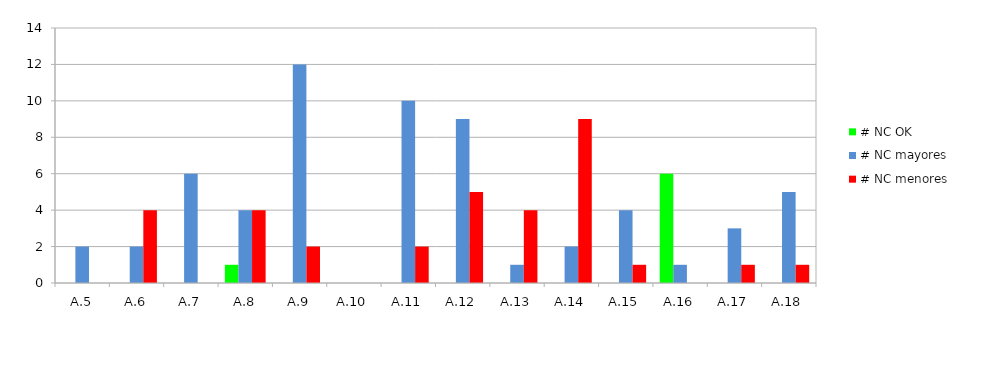
| Category | # NC OK | # NC mayores | # NC menores |
|---|---|---|---|
| A.5 | 0 | 2 | 0 |
| A.6 | 0 | 2 | 4 |
| A.7 | 0 | 6 | 0 |
| A.8 | 1 | 4 | 4 |
| A.9 | 0 | 12 | 2 |
| A.10 | 0 | 0 | 0 |
| A.11 | 0 | 10 | 2 |
| A.12 | 0 | 9 | 5 |
| A.13 | 0 | 1 | 4 |
| A.14 | 0 | 2 | 9 |
| A.15 | 0 | 4 | 1 |
| A.16 | 6 | 1 | 0 |
| A.17 | 0 | 3 | 1 |
| A.18 | 0 | 5 | 1 |